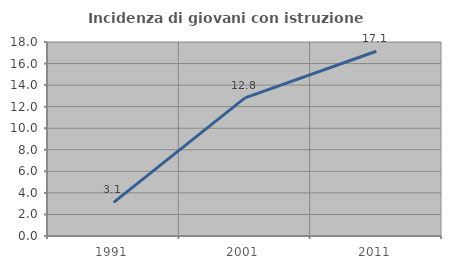
| Category | Incidenza di giovani con istruzione universitaria |
|---|---|
| 1991.0 | 3.125 |
| 2001.0 | 12.821 |
| 2011.0 | 17.143 |